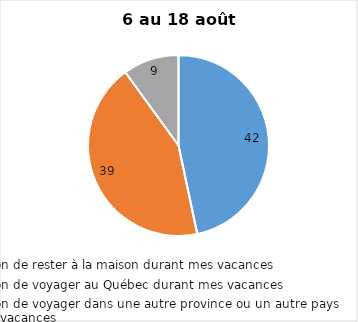
| Category | Series 0 |
|---|---|
| J’ai l’intention de rester à la maison durant mes vacances | 42 |
| J’ai l’intention de voyager au Québec durant mes vacances | 39 |
| J’ai l’intention de voyager dans une autre province ou un autre pays durant mes vacances | 9 |